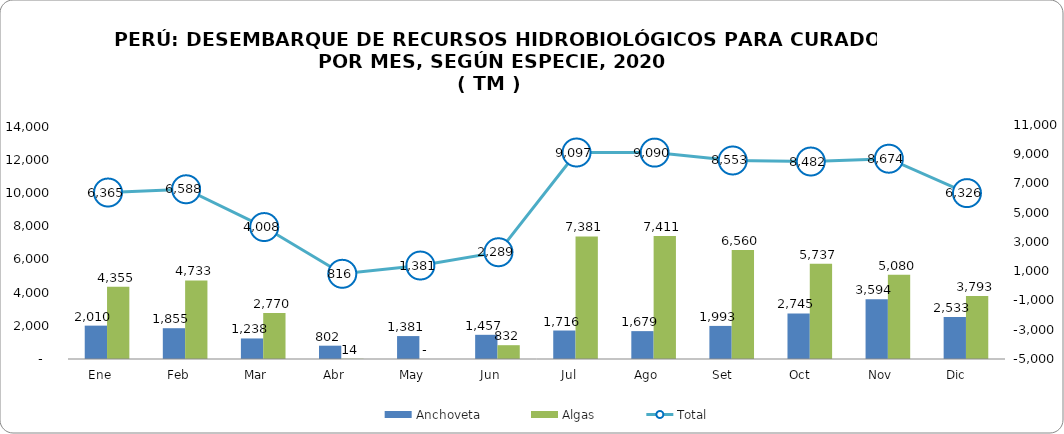
| Category | Anchoveta | Algas |
|---|---|---|
| Ene    | 2010 | 4355 |
| Feb    | 1855 | 4733 |
| Mar    | 1238 | 2770 |
| Abr    | 802 | 14 |
| May    | 1381 | 0 |
| Jun    | 1457 | 832 |
| Jul    | 1716 | 7381 |
| Ago    | 1679 | 7411 |
| Set     | 1993 | 6560 |
| Oct     | 2745 | 5737 |
| Nov    | 3594 | 5080 |
| Dic     | 2533 | 3793 |